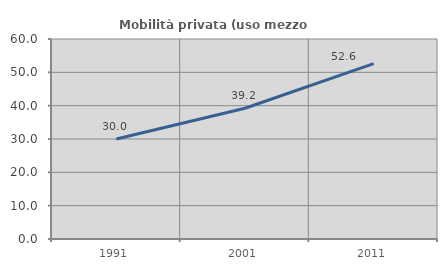
| Category | Mobilità privata (uso mezzo privato) |
|---|---|
| 1991.0 | 30 |
| 2001.0 | 39.216 |
| 2011.0 | 52.632 |